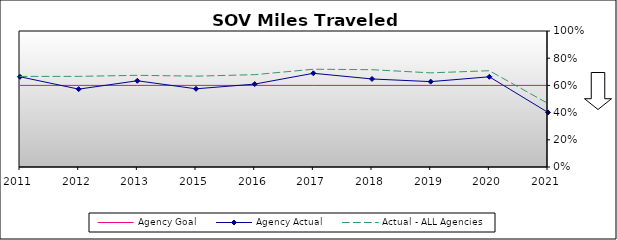
| Category | Agency Goal | Agency Actual | Actual - ALL Agencies |
|---|---|---|---|
| 2011.0 | 0.6 | 0.664 | 0.666 |
| 2012.0 | 0.6 | 0.573 | 0.666 |
| 2013.0 | 0.6 | 0.634 | 0.674 |
| 2015.0 | 0.6 | 0.575 | 0.668 |
| 2016.0 | 0.6 | 0.61 | 0.679 |
| 2017.0 | 0.6 | 0.689 | 0.719 |
| 2018.0 | 0.6 | 0.647 | 0.715 |
| 2019.0 | 0.6 | 0.628 | 0.692 |
| 2020.0 | 0.6 | 0.663 | 0.708 |
| 2021.0 | 0.6 | 0.401 | 0.467 |